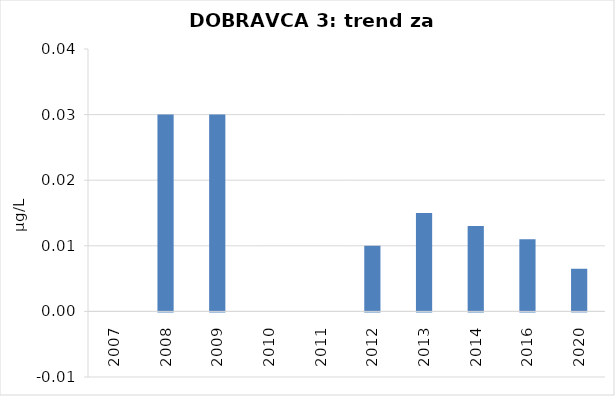
| Category | Vsota |
|---|---|
| 2007 | 0 |
| 2008 | 0.03 |
| 2009 | 0.03 |
| 2010 | 0 |
| 2011 | 0 |
| 2012 | 0.01 |
| 2013 | 0.015 |
| 2014 | 0.013 |
| 2016 | 0.011 |
| 2020 | 0.007 |